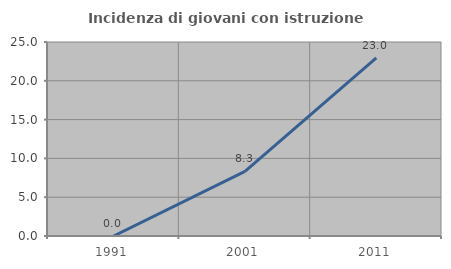
| Category | Incidenza di giovani con istruzione universitaria |
|---|---|
| 1991.0 | 0 |
| 2001.0 | 8.333 |
| 2011.0 | 22.951 |